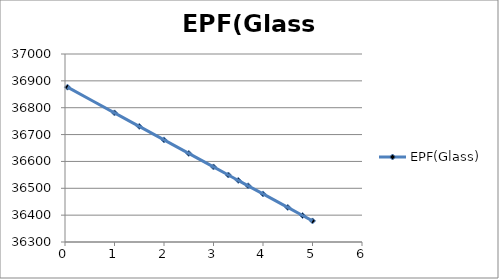
| Category | EPF(Glass) |
|---|---|
| 0.05 | 36876.416 |
| 1.0 | 36780.771 |
| 1.5 | 36730.45 |
| 2.0 | 36680.141 |
| 2.5 | 36629.842 |
| 3.0 | 36579.552 |
| 3.3 | 36549.383 |
| 3.5 | 36529.272 |
| 3.7 | 36509.163 |
| 4.0 | 36479.001 |
| 4.5 | 36428.737 |
| 4.8 | 36398.582 |
| 5.0 | 36378.48 |